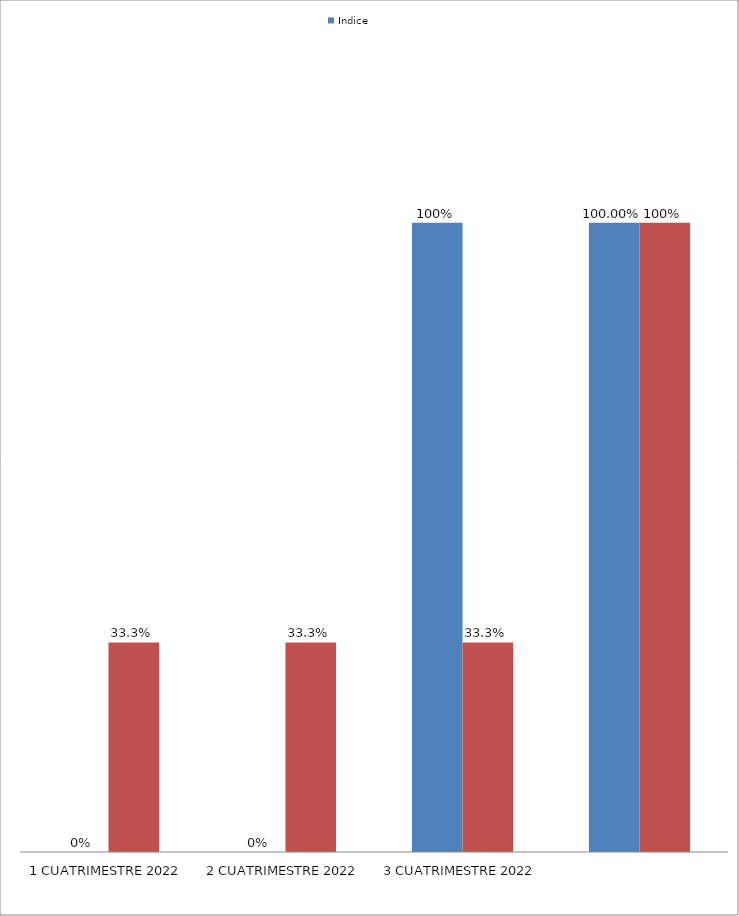
| Category | Indice | Meta trimestral de autos:  3,5 al trimestre |
|---|---|---|
| 1 CUATRIMESTRE 2022 | 0 | 0.333 |
| 2 CUATRIMESTRE 2022 | 0 | 0.333 |
| 3 CUATRIMESTRE 2022 | 1 | 0.333 |